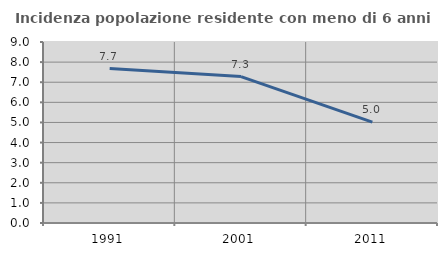
| Category | Incidenza popolazione residente con meno di 6 anni |
|---|---|
| 1991.0 | 7.679 |
| 2001.0 | 7.282 |
| 2011.0 | 5.013 |